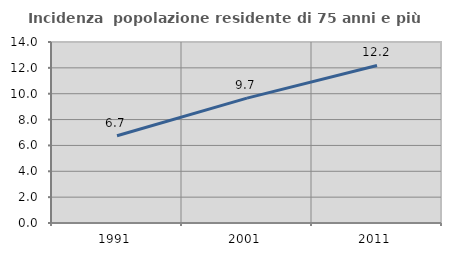
| Category | Incidenza  popolazione residente di 75 anni e più |
|---|---|
| 1991.0 | 6.748 |
| 2001.0 | 9.656 |
| 2011.0 | 12.187 |